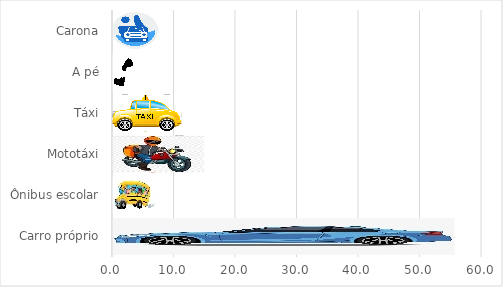
| Category | fr |
|---|---|
| Carro próprio | 55.556 |
| Ônibus escolar | 7.407 |
| Mototáxi | 14.815 |
| Táxi | 11.111 |
| A pé | 3.704 |
| Carona | 7.407 |